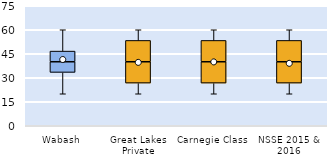
| Category | 25th | 50th | 75th |
|---|---|---|---|
| Wabash | 33.333 | 6.667 | 6.667 |
| Great Lakes Private | 26.667 | 13.333 | 13.333 |
| Carnegie Class | 26.667 | 13.333 | 13.333 |
| NSSE 2015 & 2016 | 26.667 | 13.333 | 13.333 |